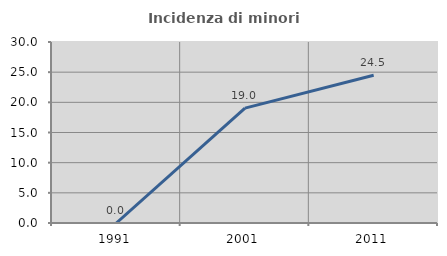
| Category | Incidenza di minori stranieri |
|---|---|
| 1991.0 | 0 |
| 2001.0 | 19.048 |
| 2011.0 | 24.49 |